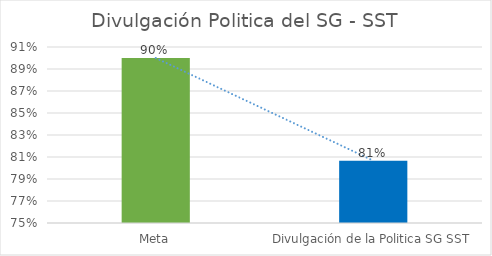
| Category | Series 0 |
|---|---|
| Meta | 0.9 |
| Divulgación de la Politica SG SST | 0.807 |